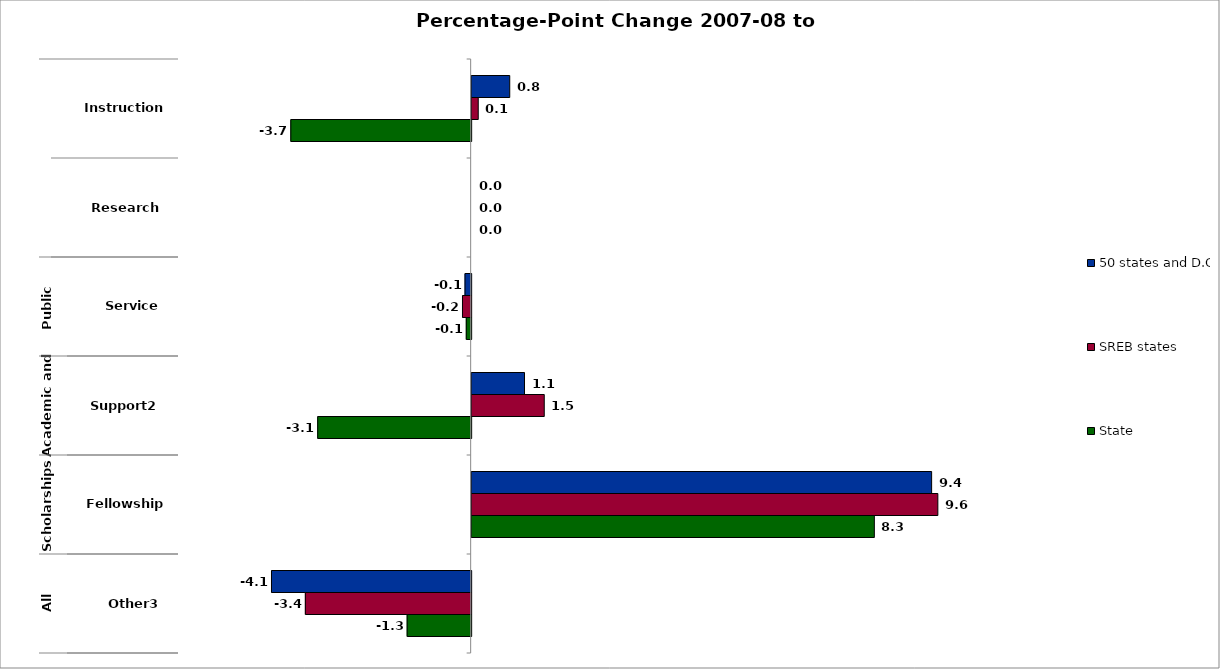
| Category | 50 states and D.C. | SREB states | State |
|---|---|---|---|
| 0 | 0.781 | 0.135 | -3.697 |
| 1 | 0 | 0 | 0 |
| 2 | -0.126 | -0.178 | -0.1 |
| 3 | 1.083 | 1.488 | -3.146 |
| 4 | 9.43 | 9.557 | 8.255 |
| 5 | -4.094 | -3.399 | -1.312 |